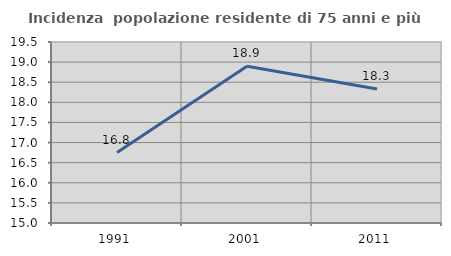
| Category | Incidenza  popolazione residente di 75 anni e più |
|---|---|
| 1991.0 | 16.752 |
| 2001.0 | 18.899 |
| 2011.0 | 18.33 |